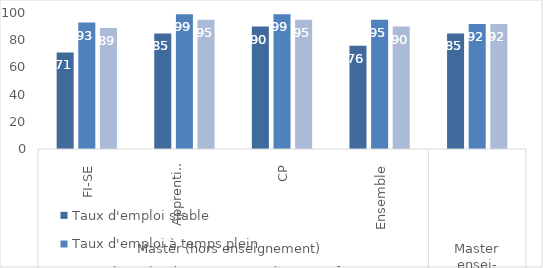
| Category | Taux d'emploi stable | Taux d'emploi à temps plein | Taux d'emploi de catégorie cadre ou professions intermédiaires |
|---|---|---|---|
| 0 | 71 | 93 | 89 |
| 1 | 85 | 99 | 95 |
| 2 | 90 | 99 | 95 |
| 3 | 76 | 95 | 90 |
| 4 | 85 | 92 | 92 |